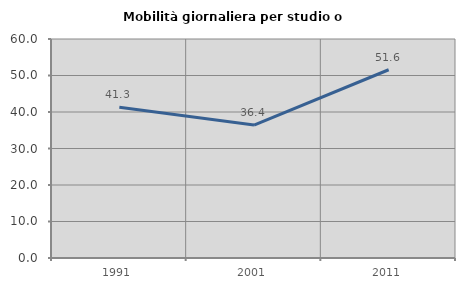
| Category | Mobilità giornaliera per studio o lavoro |
|---|---|
| 1991.0 | 41.312 |
| 2001.0 | 36.408 |
| 2011.0 | 51.578 |